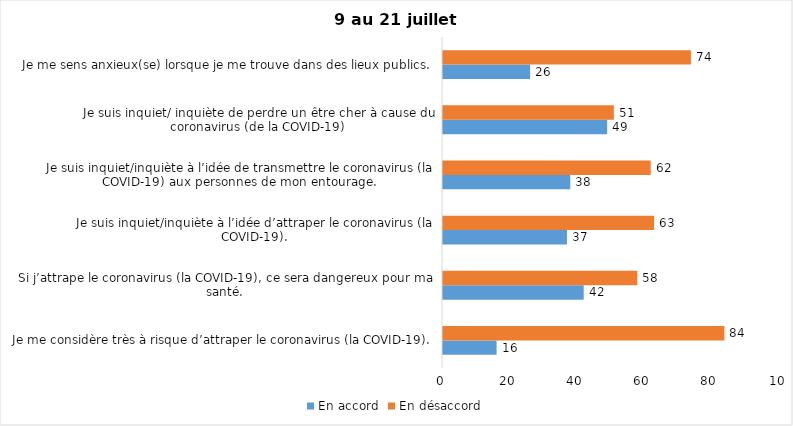
| Category | En accord | En désaccord |
|---|---|---|
| Je me considère très à risque d’attraper le coronavirus (la COVID-19). | 16 | 84 |
| Si j’attrape le coronavirus (la COVID-19), ce sera dangereux pour ma santé. | 42 | 58 |
| Je suis inquiet/inquiète à l’idée d’attraper le coronavirus (la COVID-19). | 37 | 63 |
| Je suis inquiet/inquiète à l’idée de transmettre le coronavirus (la COVID-19) aux personnes de mon entourage. | 38 | 62 |
| Je suis inquiet/ inquiète de perdre un être cher à cause du coronavirus (de la COVID-19) | 49 | 51 |
| Je me sens anxieux(se) lorsque je me trouve dans des lieux publics. | 26 | 74 |